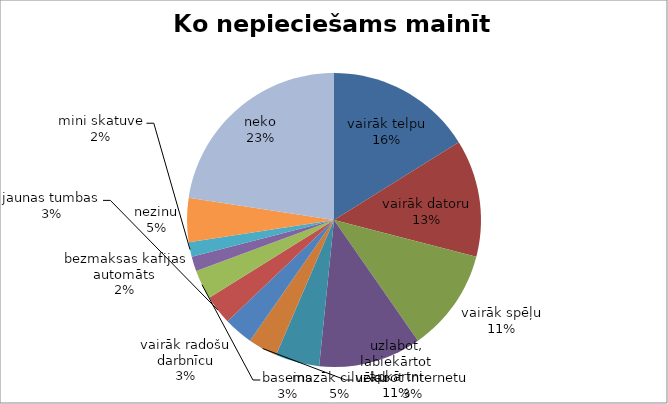
| Category | Ko nepieciešams mainīt BJC?  |
|---|---|
| vairāk telpu | 10 |
| vairāk datoru | 8 |
| vairāk spēļu | 7 |
| uzlabot, labiekārtot apkārtni | 7 |
| mazāk cilvēku | 3 |
| uzlabot internetu | 2 |
| vairāk radošu darbnīcu | 2 |
| jaunas tumbas | 2 |
| baseins | 2 |
| bezmaksas kafijas automāts | 1 |
| mini skatuve | 1 |
| nezinu | 3 |
| neko | 14 |